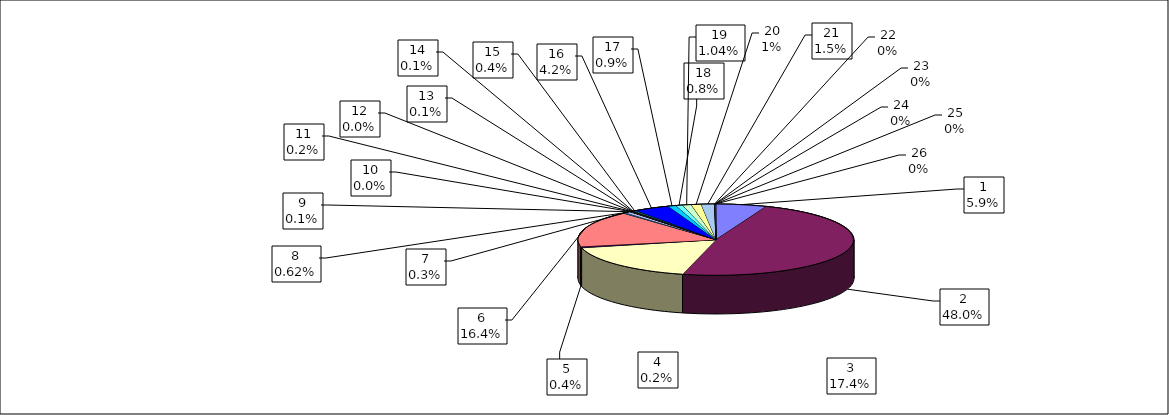
| Category | Series 0 |
|---|---|
| 0 | 5.937 |
| 1 | 47.96 |
| 2 | 17.435 |
| 3 | 0.166 |
| 4 | 0.423 |
| 5 | 16.393 |
| 6 | 0.343 |
| 7 | 0.62 |
| 8 | 0.114 |
| 9 | 0.021 |
| 10 | 0.155 |
| 11 | 0.029 |
| 12 | 0.099 |
| 13 | 0.082 |
| 14 | 0.383 |
| 15 | 4.209 |
| 16 | 0.926 |
| 17 | 0.777 |
| 18 | 1.039 |
| 19 | 1.174 |
| 20 | 1.53 |
| 21 | 0.033 |
| 22 | 0.037 |
| 23 | 0 |
| 24 | 0.045 |
| 25 | 0.069 |